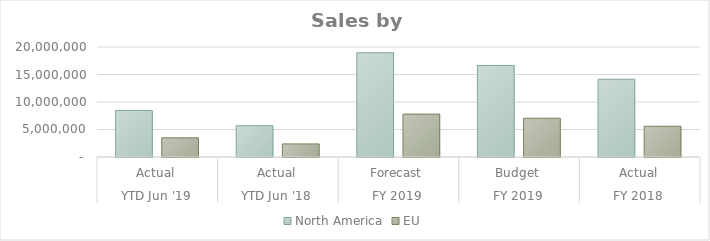
| Category | North America | EU |
|---|---|---|
| 0 | 8467627.22 | 3484367.89 |
| 1 | 5686825.79 | 2380292.8 |
| 2 | 18961251.137 | 7802418.895 |
| 3 | 16646074.87 | 7049321.08 |
| 4 | 14134245.06 | 5587754.42 |